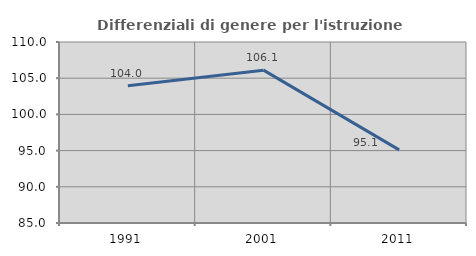
| Category | Differenziali di genere per l'istruzione superiore |
|---|---|
| 1991.0 | 103.971 |
| 2001.0 | 106.11 |
| 2011.0 | 95.094 |